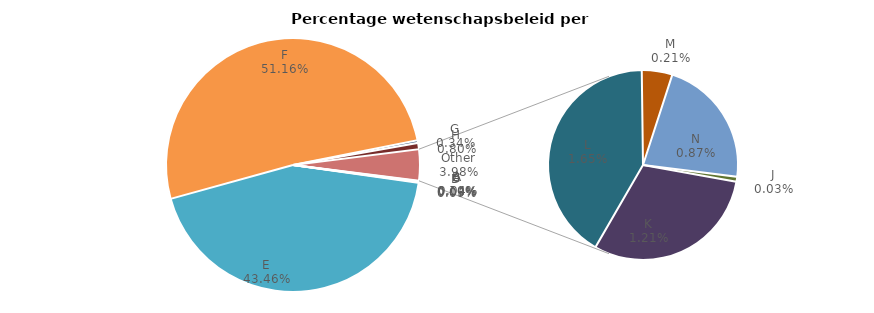
| Category | Totaal |
|---|---|
| A | 0.94 |
| B | 2.132 |
| C | 0.641 |
| D | 1.896 |
| E | 944.63 |
| F | 1111.95 |
| G | 7.396 |
| H | 17.485 |
| J | 0.72 |
| K | 26.37 |
| L | 35.812 |
| M | 4.5 |
| N | 18.997 |